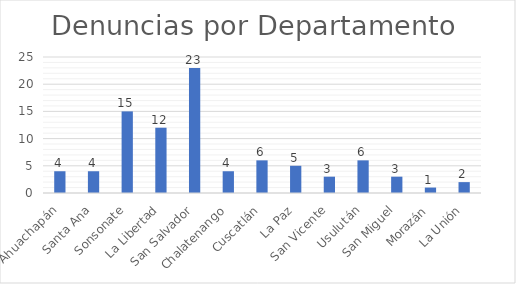
| Category | Series 0 |
|---|---|
| Ahuachapán | 4 |
| Santa Ana | 4 |
| Sonsonate | 15 |
| La Libertad | 12 |
| San Salvador | 23 |
| Chalatenango | 4 |
| Cuscatlán | 6 |
| La Paz | 5 |
| San Vicente | 3 |
| Usulután | 6 |
| San Miguel | 3 |
| Morazán | 1 |
| La Unión | 2 |